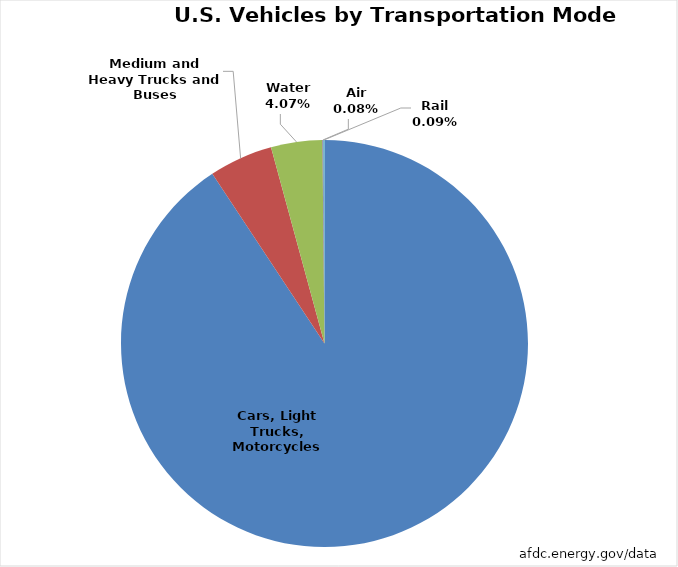
| Category | Series 0 |
|---|---|
| Cars, Light Trucks, Motorcycles | 267556593 |
| Medium and Heavy Trucks and Buses | 14928446 |
| Water | 12002825 |
| Air | 215009 |
| Rail | 268275 |